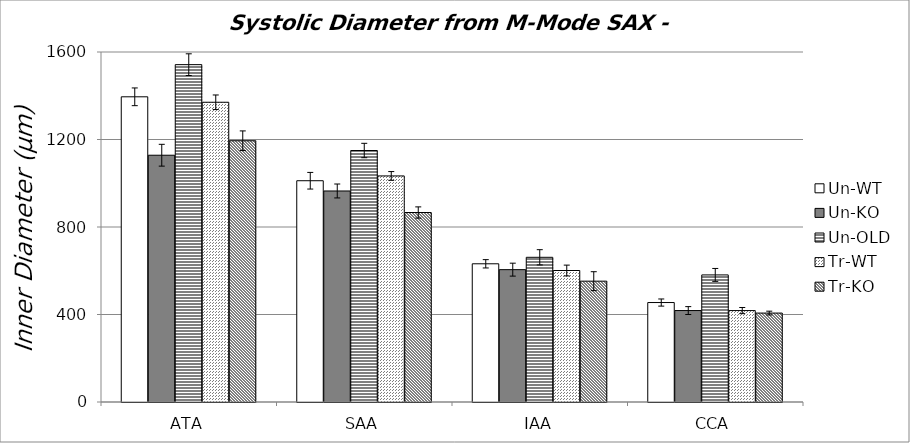
| Category | Un-WT | Un-KO | Un-OLD | Tr-WT | Tr-KO |
|---|---|---|---|---|---|
| 0 | 1395.166 | 1128.134 | 1542.148 | 1370.215 | 1194.339 |
| 1 | 1011.512 | 964.7 | 1149.66 | 1033.442 | 866.233 |
| 2 | 631.79 | 605.034 | 661.469 | 601.082 | 552.38 |
| 3 | 454.659 | 418.02 | 580.943 | 417.985 | 406.545 |